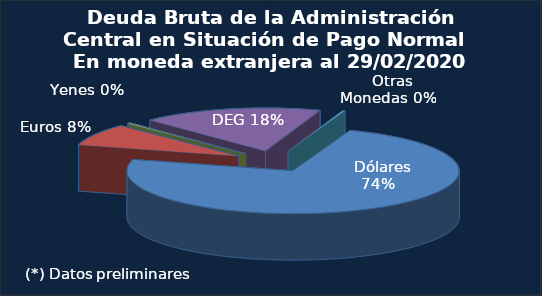
| Category | Series 0 |
|---|---|
|   Dólares | 184144.5 |
|   Euros | 20551.3 |
|   Yenes | 763.8 |
|   DEG | 43838.5 |
|   Otras Monedas | 582.8 |